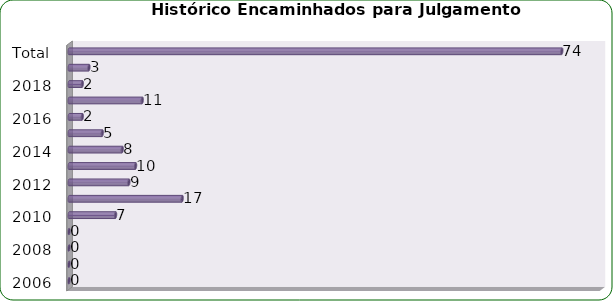
| Category | Total de Sindicâncias  |
|---|---|
| 2006 | 0 |
| 2007 | 0 |
| 2008 | 0 |
| 2009 | 0 |
| 2010 | 7 |
| 2011 | 17 |
| 2012 | 9 |
| 2013 | 10 |
| 2014 | 8 |
| 2015 | 5 |
| 2016 | 2 |
| 2017 | 11 |
| 2018 | 2 |
| 2019 | 3 |
| Total | 74 |